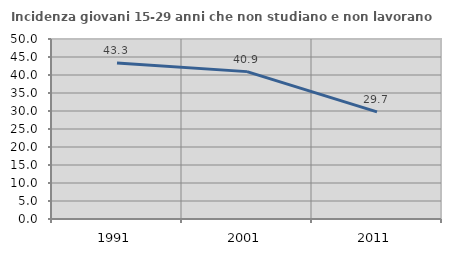
| Category | Incidenza giovani 15-29 anni che non studiano e non lavorano  |
|---|---|
| 1991.0 | 43.333 |
| 2001.0 | 40.937 |
| 2011.0 | 29.748 |